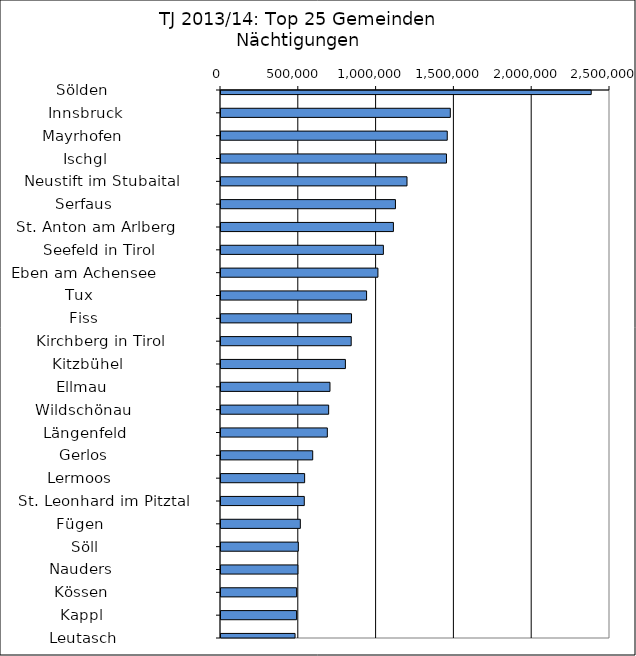
| Category | Series 0 |
|---|---|
|   Sölden                     | 2379231 |
|   Innsbruck                  | 1473769 |
|   Mayrhofen                  | 1454088 |
|   Ischgl                     | 1449091 |
|   Neustift im Stubaital      | 1195458 |
|   Serfaus                    | 1121118 |
|   St. Anton am Arlberg       | 1108067 |
|   Seefeld in Tirol           | 1043577 |
|   Eben am Achensee           | 1008585 |
|   Tux                        | 935612 |
|   Fiss                       | 838823 |
|   Kirchberg in Tirol         | 836711 |
|   Kitzbühel                  | 799428 |
|   Ellmau                     | 700349 |
|   Wildschönau                | 691961 |
|   Längenfeld                 | 683434 |
|   Gerlos                     | 589439 |
|   Lermoos                    | 537441 |
|   St. Leonhard im Pitztal    | 535285 |
|   Fügen                      | 509886 |
|   Söll                       | 496818 |
|   Nauders                    | 494144 |
|   Kössen                     | 486066 |
|   Kappl                      | 485819 |
|   Leutasch                   | 475958 |